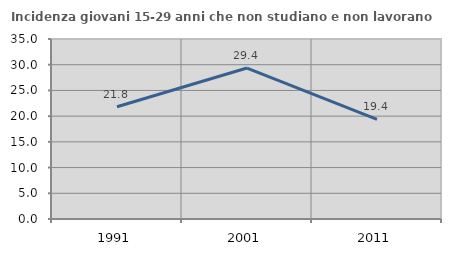
| Category | Incidenza giovani 15-29 anni che non studiano e non lavorano  |
|---|---|
| 1991.0 | 21.827 |
| 2001.0 | 29.355 |
| 2011.0 | 19.383 |